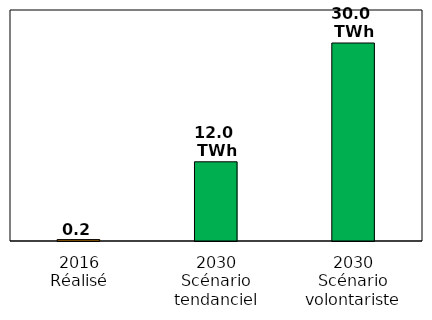
| Category | Series 0 |
|---|---|
| 2016
Réalisé | 0.215 |
| 2030
Scénario tendanciel | 12 |
| 2030
Scénario volontariste | 30 |